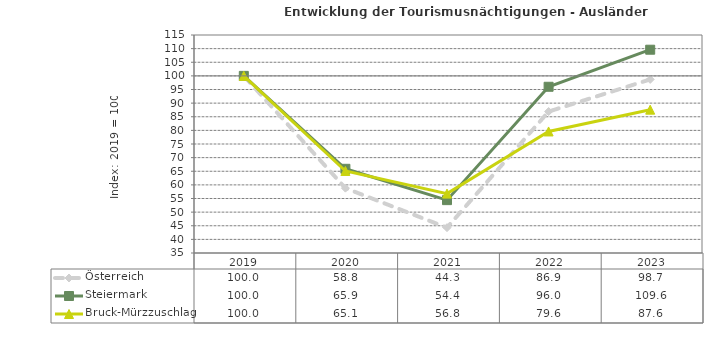
| Category | Österreich | Steiermark | Bruck-Mürzzuschlag |
|---|---|---|---|
| 2023.0 | 98.7 | 109.6 | 87.6 |
| 2022.0 | 86.9 | 96 | 79.6 |
| 2021.0 | 44.3 | 54.4 | 56.8 |
| 2020.0 | 58.8 | 65.9 | 65.1 |
| 2019.0 | 100 | 100 | 100 |